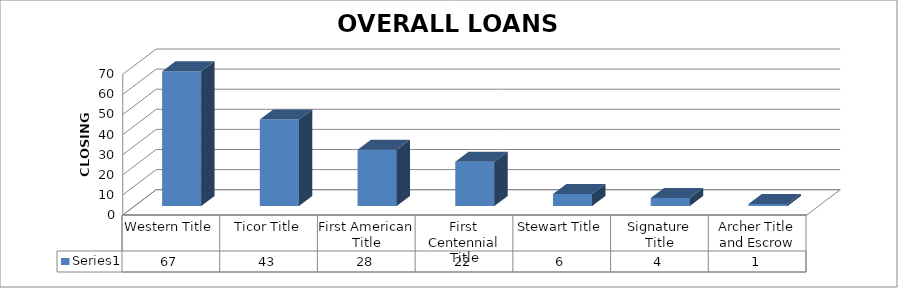
| Category | Series 0 |
|---|---|
| Western Title | 67 |
| Ticor Title | 43 |
| First American Title | 28 |
| First Centennial Title | 22 |
| Stewart Title | 6 |
| Signature Title | 4 |
| Archer Title and Escrow | 1 |